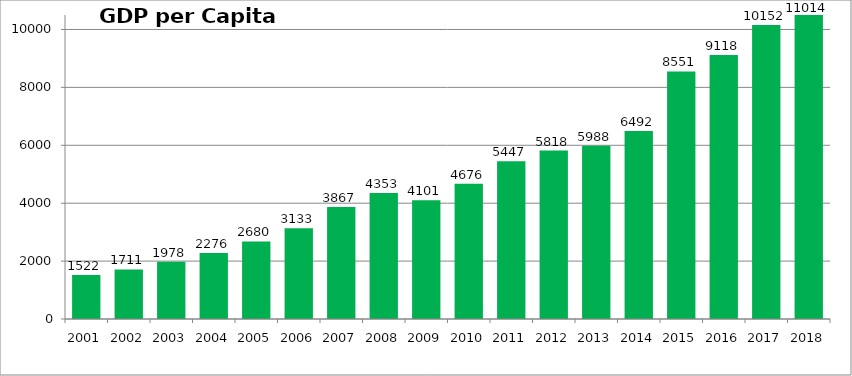
| Category | GDP per Capita (GEL) |
|---|---|
| 2001.0 | 1521.809 |
| 2002.0 | 1711.229 |
| 2003.0 | 1977.861 |
| 2004.0 | 2275.538 |
| 2005.0 | 2679.766 |
| 2006.0 | 3133.145 |
| 2007.0 | 3866.88 |
| 2008.0 | 4352.902 |
| 2009.0 | 4101.326 |
| 2010.0 | 4675.72 |
| 2011.0 | 5447.057 |
| 2012.0 | 5818.055 |
| 2013.0 | 5987.634 |
| 2014.0 | 6491.6 |
| 2015.0 | 8550.79 |
| 2016.0 | 9118 |
| 2017.0 | 10152 |
| 2018.0 | 11013.9 |